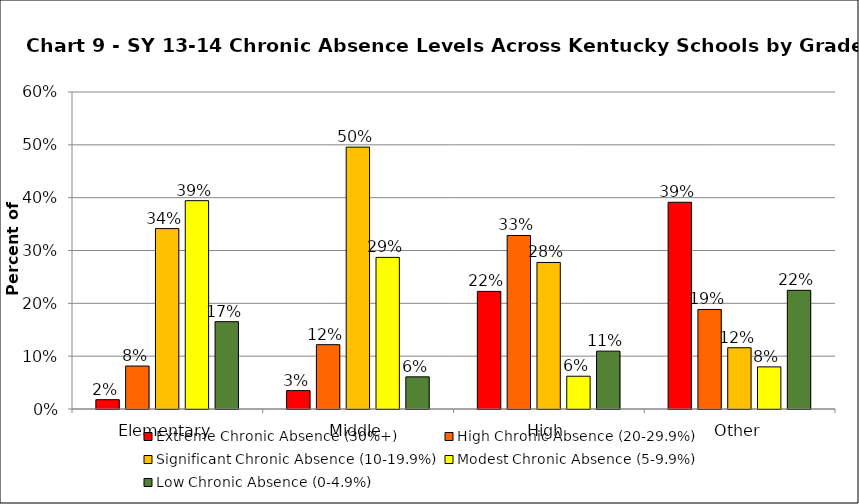
| Category | Extreme Chronic Absence (30%+) | High Chronic Absence (20-29.9%) | Significant Chronic Absence (10-19.9%) | Modest Chronic Absence (5-9.9%) | Low Chronic Absence (0-4.9%) |
|---|---|---|---|---|---|
| 0 | 0.018 | 0.081 | 0.341 | 0.394 | 0.165 |
| 1 | 0.035 | 0.122 | 0.496 | 0.287 | 0.061 |
| 2 | 0.223 | 0.328 | 0.277 | 0.062 | 0.109 |
| 3 | 0.391 | 0.188 | 0.116 | 0.08 | 0.225 |